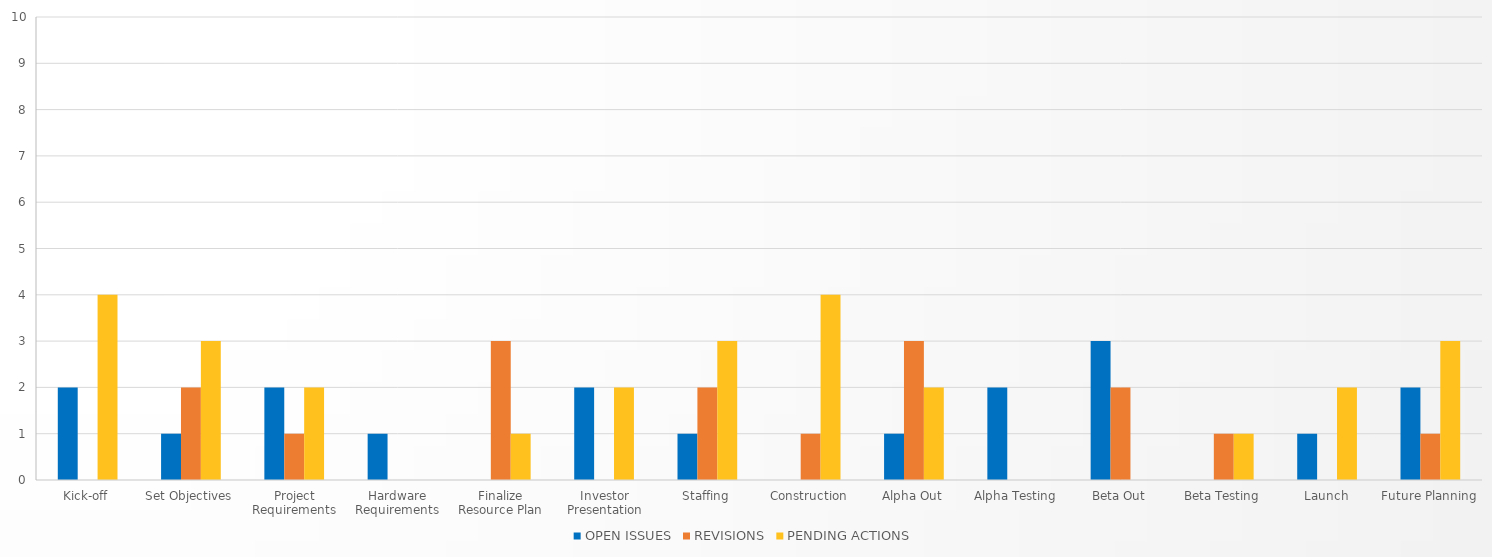
| Category | OPEN ISSUES | REVISIONS | PENDING ACTIONS |
|---|---|---|---|
| Kick-off | 2 | 0 | 4 |
| Set Objectives | 1 | 2 | 3 |
| Project Requirements | 2 | 1 | 2 |
| Hardware Requirements | 1 | 0 | 0 |
| Finalize Resource Plan | 0 | 3 | 1 |
| Investor Presentation | 2 | 0 | 2 |
| Staffing | 1 | 2 | 3 |
| Construction | 0 | 1 | 4 |
| Alpha Out | 1 | 3 | 2 |
| Alpha Testing | 2 | 0 | 0 |
| Beta Out | 3 | 2 | 0 |
| Beta Testing | 0 | 1 | 1 |
| Launch | 1 | 0 | 2 |
| Future Planning | 2 | 1 | 3 |